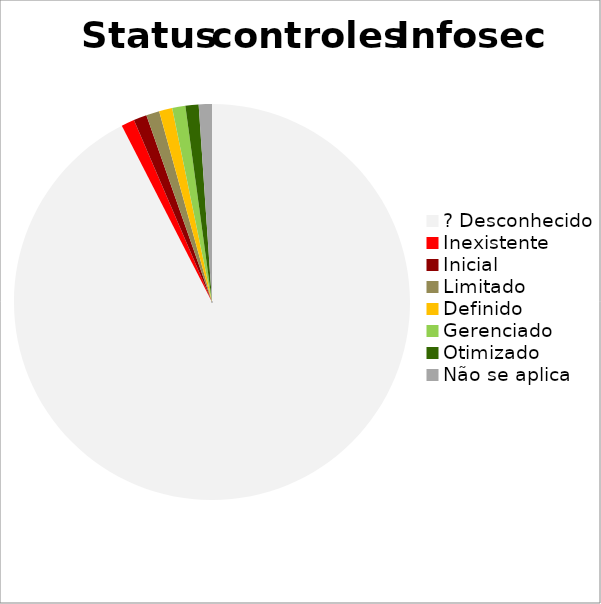
| Category | Relação de controles para segurança da informação |
|---|---|
| ? Desconhecido | 0.925 |
| Inexistente | 0.011 |
| Inicial | 0.011 |
| Limitado | 0.011 |
| Definido | 0.011 |
| Gerenciado | 0.011 |
| Otimizado | 0.011 |
| Não se aplica | 0.011 |